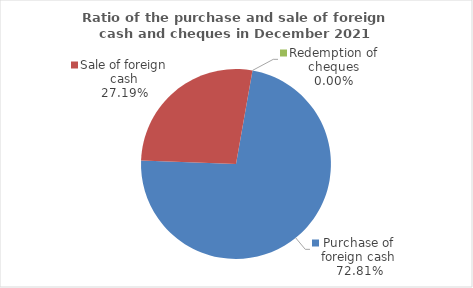
| Category | Series 0 |
|---|---|
| Purchase of foreign cash | 72.813 |
| Sale of foreign cash | 27.187 |
| Redemption of cheques | 0 |